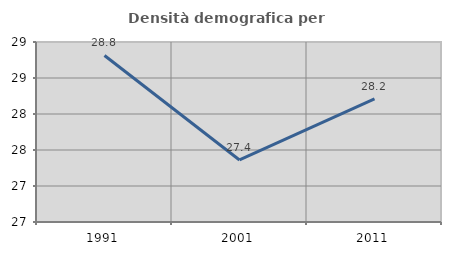
| Category | Densità demografica |
|---|---|
| 1991.0 | 28.813 |
| 2001.0 | 27.361 |
| 2011.0 | 28.209 |